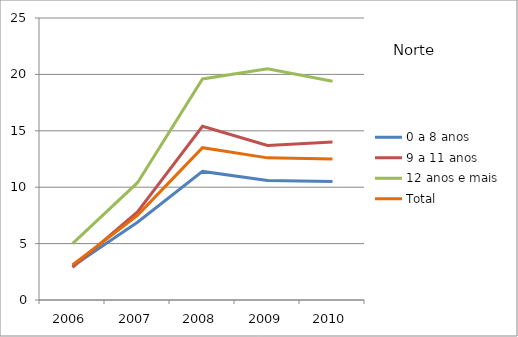
| Category | 0 a 8 anos | 9 a 11 anos | 12 anos e mais | Total |
|---|---|---|---|---|
| 2006.0 | 3 | 2.9 | 5 | 3.1 |
| 2007.0 | 6.9 | 7.8 | 10.4 | 7.5 |
| 2008.0 | 11.4 | 15.4 | 19.6 | 13.5 |
| 2009.0 | 10.6 | 13.7 | 20.5 | 12.6 |
| 2010.0 | 10.5 | 14 | 19.4 | 12.5 |